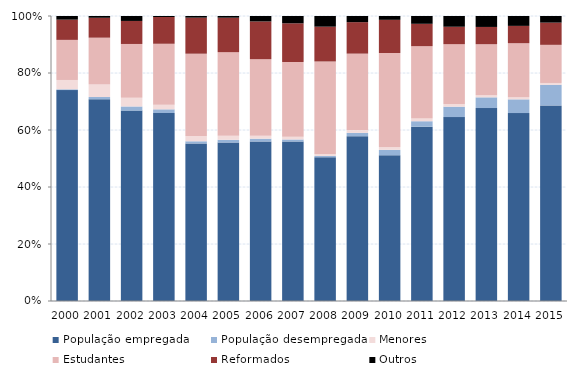
| Category | População empregada | População desempregada | Menores | Estudantes | Reformados | Outros |
|---|---|---|---|---|---|---|
| 2000.0 | 74.006 | 0.284 | 3.267 | 14.062 | 7.102 | 1.278 |
| 2001.0 | 70.807 | 0.776 | 4.348 | 16.46 | 6.988 | 0.621 |
| 2002.0 | 66.811 | 1.443 | 3.03 | 18.903 | 8.081 | 1.732 |
| 2003.0 | 65.962 | 1.291 | 1.643 | 21.362 | 9.39 | 0.352 |
| 2004.0 | 55.3 | 0.74 | 1.89 | 28.841 | 12.654 | 0.575 |
| 2005.0 | 55.585 | 0.967 | 1.45 | 29.323 | 12.084 | 0.591 |
| 2006.0 | 55.98 | 0.983 | 1.038 | 26.871 | 13.217 | 1.912 |
| 2007.0 | 55.977 | 0.707 | 0.964 | 26.221 | 13.56 | 2.571 |
| 2008.0 | 50.452 | 0.452 | 0.711 | 32.429 | 12.209 | 3.747 |
| 2009.0 | 57.837 | 1.164 | 0.958 | 26.831 | 11.054 | 2.156 |
| 2010.0 | 51.139 | 1.912 | 0.854 | 33.116 | 11.635 | 1.343 |
| 2011.0 | 61.15 | 1.926 | 0.933 | 25.429 | 7.824 | 2.738 |
| 2012.0 | 64.537 | 3.645 | 0.943 | 21.01 | 6.096 | 3.77 |
| 2013.0 | 67.707 | 3.752 | 0.736 | 17.9 | 6.066 | 3.839 |
| 2014.0 | 65.943 | 4.816 | 0.741 | 18.947 | 6.086 | 3.467 |
| 2015.0 | 68.636 | 7.235 | 0.631 | 13.375 | 7.8 | 2.323 |